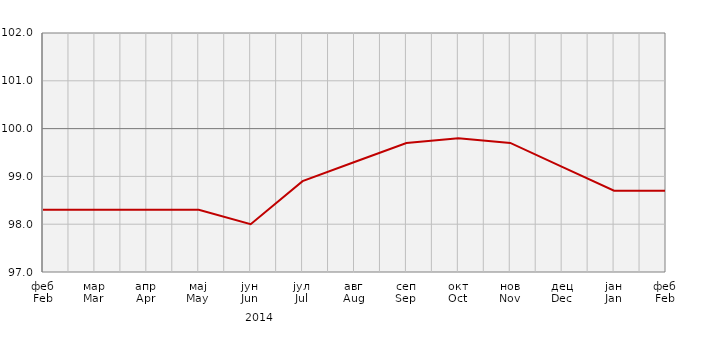
| Category | Индекси потрошачких цијена
Consumer price indices |
|---|---|
| феб
Feb | 98.3 |
| мар
Mar | 98.3 |
| апр
Apr | 98.3 |
| мај
May | 98.3 |
| јун
Jun | 98 |
| јул
Jul | 98.9 |
| авг
Aug | 99.3 |
| сеп
Sep | 99.7 |
| окт
Oct | 99.8 |
| нов
Nov | 99.7 |
| дец
Dec | 99.2 |
| јан
Jan | 98.7 |
| феб
Feb | 98.7 |